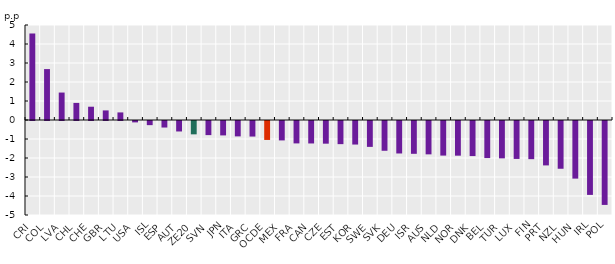
| Category | Inactivity rate  |
|---|---|
| CRI | 4.553 |
| COL | 2.68 |
| LVA | 1.445 |
| CHL | 0.899 |
| CHE | 0.699 |
| GBR | 0.504 |
| LTU | 0.399 |
| USA | -0.073 |
| ISL | -0.218 |
| ESP | -0.344 |
| AUT | -0.551 |
| ZE20 | -0.702 |
| SVN | -0.743 |
| JPN | -0.758 |
| ITA | -0.81 |
| GRC | -0.819 |
| OCDE | -0.997 |
| MEX | -1.022 |
| FRA | -1.179 |
| CAN | -1.182 |
| CZE | -1.193 |
| EST | -1.218 |
| KOR | -1.239 |
| SWE | -1.363 |
| SVK | -1.567 |
| DEU | -1.71 |
| ISR | -1.727 |
| AUS | -1.756 |
| NLD | -1.821 |
| NOR | -1.825 |
| DNK | -1.846 |
| BEL | -1.951 |
| TUR | -1.966 |
| LUX | -1.997 |
| FIN | -2.009 |
| PRT | -2.337 |
| NZL | -2.514 |
| HUN | -3.032 |
| IRL | -3.89 |
| POL | -4.417 |